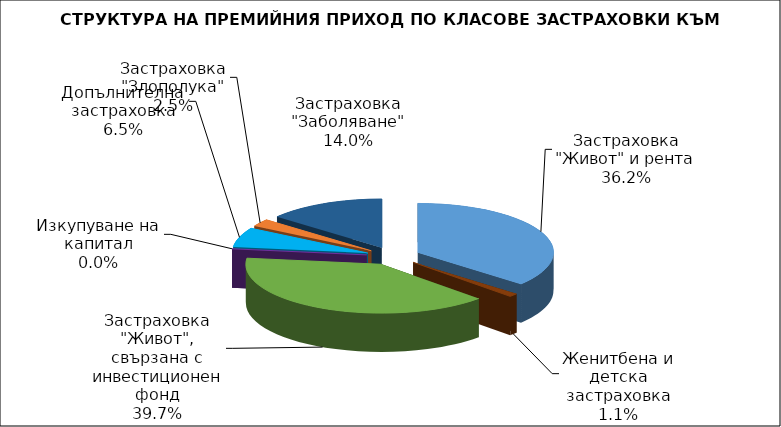
| Category | Застраховка "Живот" и рента |
|---|---|
| Застраховка "Живот" и рента | 127548680.327 |
| Женитбена и детска застраховка | 3861447.926 |
| Застраховка "Живот", свързана с инвестиционен фонд | 139722094.119 |
| Изкупуване на капитал | 0 |
| Допълнителна застраховка | 22831160.154 |
| Застраховка "Злополука" | 8660855.65 |
| Застраховка "Заболяване" | 49467757.94 |